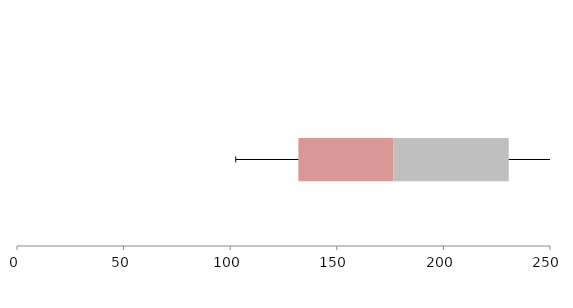
| Category | Series 1 | Series 2 | Series 3 |
|---|---|---|---|
| 0 | 131.985 | 44.629 | 54.037 |